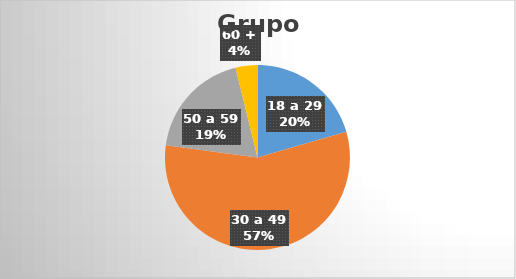
| Category | Series 1 | Series 2 | Series 0 |
|---|---|---|---|
| 18 a 29 | 70 | 5 | 5 |
| 30 a 49 | 193 | 0 | 0 |
| 50 a 59 | 65 | 0 | 0 |
| 60 + | 13 | 336 | 336 |